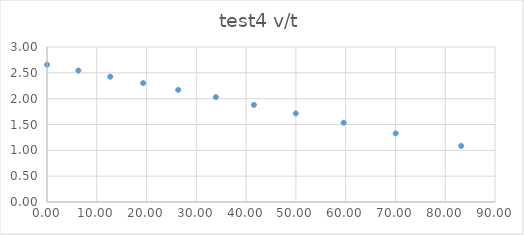
| Category | test1 v/t |
|---|---|
| 0.0 | 2.658 |
| 6.3 | 2.545 |
| 12.71 | 2.426 |
| 19.31 | 2.302 |
| 26.35 | 2.17 |
| 33.93 | 2.03 |
| 41.57 | 1.879 |
| 49.98 | 1.716 |
| 59.59 | 1.534 |
| 70.05 | 1.329 |
| 83.2 | 1.085 |